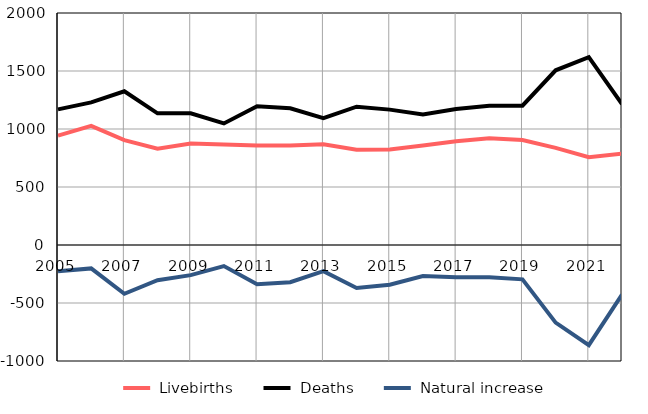
| Category |  Livebirths |  Deaths |  Natural increase |
|---|---|---|---|
| 2005.0 | 943 | 1169 | -226 |
| 2006.0 | 1027 | 1229 | -202 |
| 2007.0 | 904 | 1325 | -421 |
| 2008.0 | 831 | 1135 | -304 |
| 2009.0 | 875 | 1135 | -260 |
| 2010.0 | 866 | 1048 | -182 |
| 2011.0 | 857 | 1196 | -339 |
| 2012.0 | 857 | 1178 | -321 |
| 2013.0 | 868 | 1094 | -226 |
| 2014.0 | 822 | 1192 | -370 |
| 2015.0 | 824 | 1167 | -343 |
| 2016.0 | 857 | 1125 | -268 |
| 2017.0 | 895 | 1172 | -277 |
| 2018.0 | 921 | 1200 | -279 |
| 2019.0 | 905 | 1201 | -296 |
| 2020.0 | 837 | 1506 | -669 |
| 2021.0 | 757 | 1620 | -863 |
| 2022.0 | 788 | 1215 | -427 |